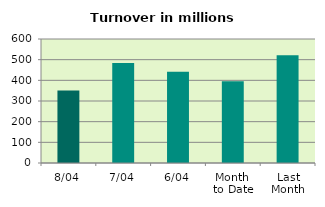
| Category | Series 0 |
|---|---|
| 8/04 | 351.39 |
| 7/04 | 484.082 |
| 6/04 | 441.06 |
| Month 
to Date | 395.107 |
| Last
Month | 521.26 |